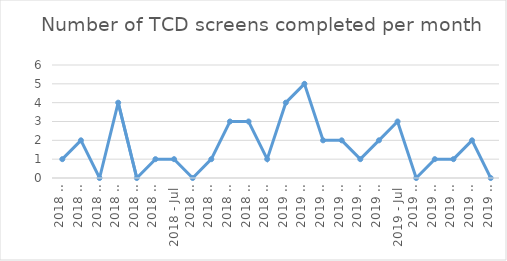
| Category | Number of Screens |
|---|---|
| 2018 - Jan | 1 |
| 2018 - Feb | 2 |
| 2018 - Mar | 0 |
| 2018 - Apr | 4 |
| 2018 - May | 0 |
| 2018 - Jun | 1 |
| 2018 - Jul | 1 |
| 2018 - Aug | 0 |
| 2018 - Sep | 1 |
| 2018 - Oct | 3 |
| 2018 - Nov | 3 |
| 2018 - Dec | 1 |
| 2019 - Jan | 4 |
| 2019 - Feb | 5 |
| 2019 - Mar | 2 |
| 2019 - Apr | 2 |
| 2019 - May | 1 |
| 2019 - Jun | 2 |
| 2019 - Jul | 3 |
| 2019 - Aug | 0 |
| 2019 - Sep | 1 |
| 2019 - Oct | 1 |
| 2019 - Nov | 2 |
| 2019 - Dec | 0 |